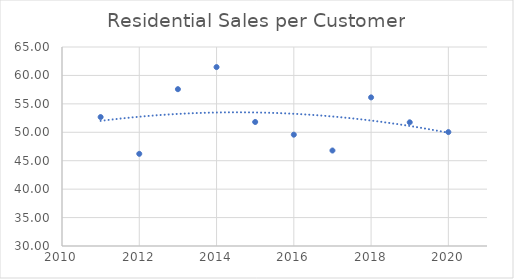
| Category | Series 0 |
|---|---|
| 2020.0 | 50.036 |
| 2019.0 | 51.755 |
| 2018.0 | 56.14 |
| 2017.0 | 46.793 |
| 2016.0 | 49.578 |
| 2015.0 | 51.812 |
| 2014.0 | 61.469 |
| 2013.0 | 57.582 |
| 2012.0 | 46.21 |
| 2011.0 | 52.678 |